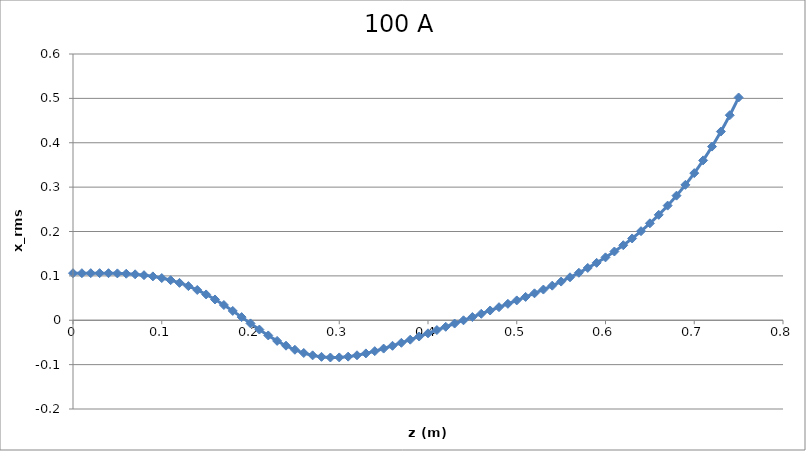
| Category | Series 0 |
|---|---|
| 0.0 | 0.106 |
| 0.01 | 0.106 |
| 0.02 | 0.106 |
| 0.03 | 0.106 |
| 0.04 | 0.106 |
| 0.05 | 0.106 |
| 0.06 | 0.105 |
| 0.07 | 0.104 |
| 0.08 | 0.102 |
| 0.09 | 0.099 |
| 0.1 | 0.095 |
| 0.11 | 0.09 |
| 0.12 | 0.084 |
| 0.13 | 0.077 |
| 0.14 | 0.068 |
| 0.15 | 0.058 |
| 0.16 | 0.047 |
| 0.17 | 0.034 |
| 0.18 | 0.021 |
| 0.19 | 0.007 |
| 0.2 | -0.007 |
| 0.21 | -0.021 |
| 0.22 | -0.034 |
| 0.23 | -0.047 |
| 0.24 | -0.057 |
| 0.25 | -0.066 |
| 0.26 | -0.074 |
| 0.27 | -0.079 |
| 0.28 | -0.082 |
| 0.29 | -0.084 |
| 0.3 | -0.084 |
| 0.31 | -0.082 |
| 0.32 | -0.079 |
| 0.33 | -0.075 |
| 0.34 | -0.07 |
| 0.35 | -0.064 |
| 0.36 | -0.058 |
| 0.37 | -0.051 |
| 0.38 | -0.044 |
| 0.39 | -0.037 |
| 0.4 | -0.029 |
| 0.41 | -0.022 |
| 0.42 | -0.015 |
| 0.43 | -0.007 |
| 0.44 | 0 |
| 0.45 | 0.007 |
| 0.46 | 0.015 |
| 0.47 | 0.022 |
| 0.48 | 0.029 |
| 0.49 | 0.037 |
| 0.5 | 0.045 |
| 0.51 | 0.053 |
| 0.52 | 0.061 |
| 0.53 | 0.069 |
| 0.54 | 0.078 |
| 0.55 | 0.087 |
| 0.56 | 0.097 |
| 0.57 | 0.107 |
| 0.58 | 0.118 |
| 0.59 | 0.129 |
| 0.6 | 0.142 |
| 0.61 | 0.155 |
| 0.62 | 0.169 |
| 0.63 | 0.184 |
| 0.64 | 0.201 |
| 0.65 | 0.218 |
| 0.66 | 0.238 |
| 0.67 | 0.258 |
| 0.68 | 0.281 |
| 0.69 | 0.305 |
| 0.7 | 0.332 |
| 0.71 | 0.36 |
| 0.72 | 0.391 |
| 0.73 | 0.425 |
| 0.74 | 0.462 |
| 0.75 | 0.502 |